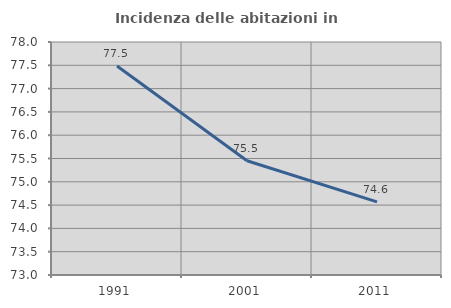
| Category | Incidenza delle abitazioni in proprietà  |
|---|---|
| 1991.0 | 77.483 |
| 2001.0 | 75.453 |
| 2011.0 | 74.57 |